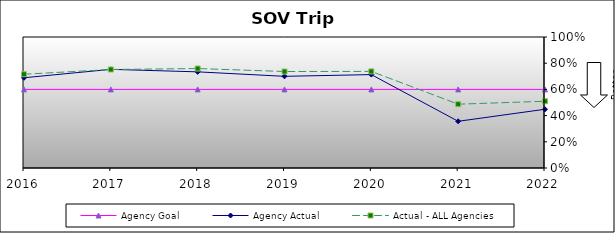
| Category | Agency Goal | Agency Actual | Actual - ALL Agencies |
|---|---|---|---|
| 2016.0 | 0.6 | 0.689 | 0.716 |
| 2017.0 | 0.6 | 0.753 | 0.752 |
| 2018.0 | 0.6 | 0.734 | 0.759 |
| 2019.0 | 0.6 | 0.7 | 0.736 |
| 2020.0 | 0.6 | 0.713 | 0.737 |
| 2021.0 | 0.6 | 0.356 | 0.487 |
| 2022.0 | 0.6 | 0.448 | 0.509 |